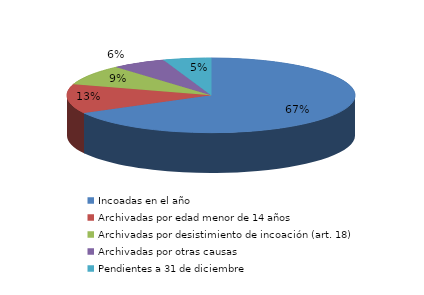
| Category | Series 0 |
|---|---|
| Incoadas en el año | 313 |
| Archivadas por edad menor de 14 años | 59 |
| Archivadas por desistimiento de incoación (art. 18) | 41 |
| Archivadas por otras causas | 28 |
| Pendientes a 31 de diciembre | 25 |